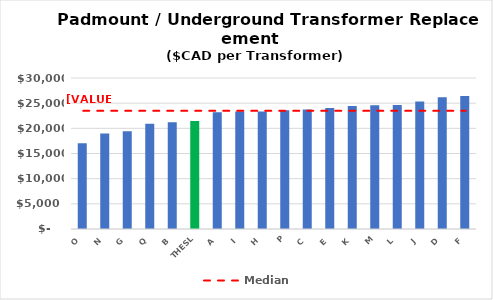
| Category | Series 0 |
|---|---|
| O | 17029.226 |
| N | 18951.191 |
| G | 19404.959 |
| Q | 20906.259 |
| B | 21224.266 |
| THESL | 21454 |
| A | 23173.17 |
| I | 23329.716 |
| H | 23357.699 |
| P | 23600.287 |
| C | 23746.661 |
| E | 24029.931 |
| K | 24433.24 |
| M | 24576.29 |
| L | 24649.606 |
| J | 25331.858 |
| D | 26155.274 |
| F | 26419.843 |